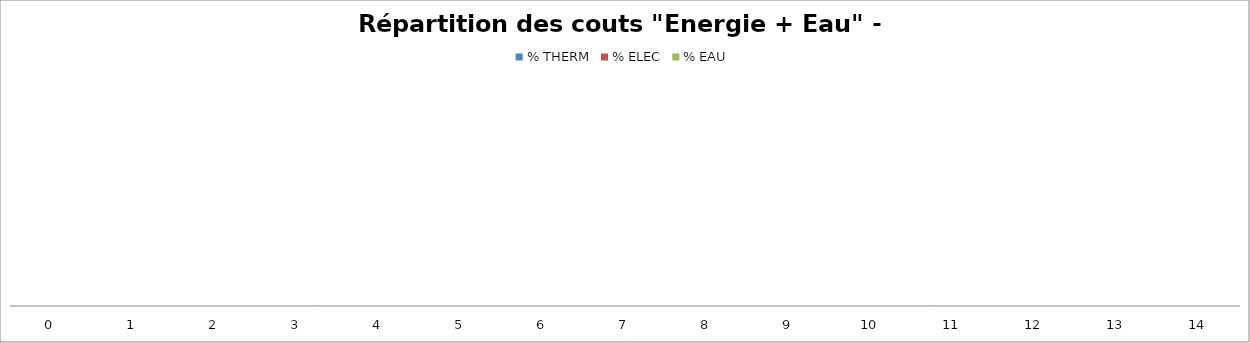
| Category | % THERM | % ELEC | % EAU |
|---|---|---|---|
| 0.0 | 0 | 0 | 0 |
| 1.0 | 0 | 0 | 0 |
| 2.0 | 0 | 0 | 0 |
| 3.0 | 0 | 0 | 0 |
| 4.0 | 0 | 0 | 0 |
| 5.0 | 0 | 0 | 0 |
| 6.0 | 0 | 0 | 0 |
| 7.0 | 0 | 0 | 0 |
| 8.0 | 0 | 0 | 0 |
| 9.0 | 0 | 0 | 0 |
| 10.0 | 0 | 0 | 0 |
| 11.0 | 0 | 0 | 0 |
| 12.0 | 0 | 0 | 0 |
| 13.0 | 0 | 0 | 0 |
| 14.0 | 0 | 0 | 0 |